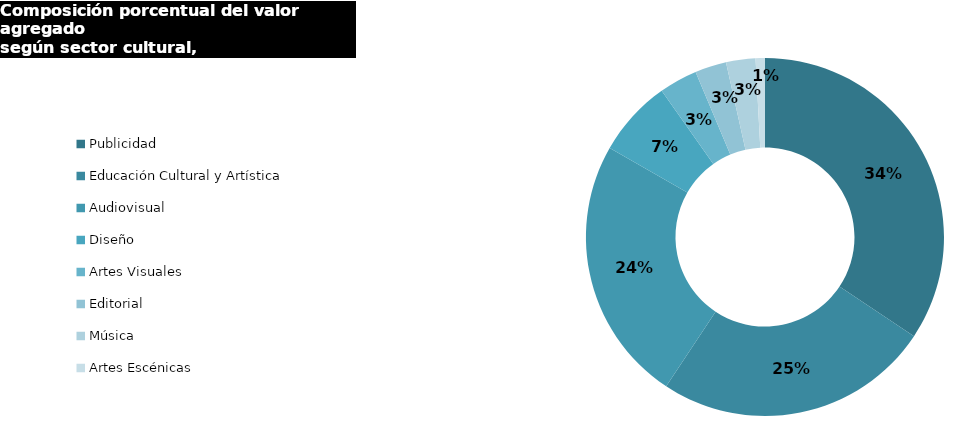
| Category | Series 0 |
|---|---|
| Publicidad | 0.007 |
| Educación Cultural y Artística | 0.005 |
| Audiovisual | 0.005 |
| Diseño | 0.001 |
| Artes Visuales | 0.001 |
| Editorial | 0.001 |
| Música | 0.001 |
| Artes Escénicas | 0 |